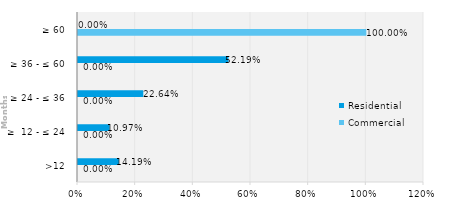
| Category | Commercial | Residential |
|---|---|---|
| >12 | 0 | 0.142 |
| ≥  12 - ≤ 24 | 0 | 0.11 |
| ≥ 24 - ≤ 36 | 0 | 0.226 |
| ≥ 36 - ≤ 60 | 0 | 0.522 |
| ≥ 60 | 1 | 0 |